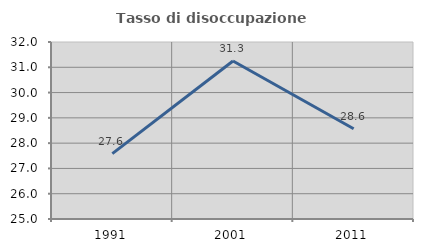
| Category | Tasso di disoccupazione giovanile  |
|---|---|
| 1991.0 | 27.586 |
| 2001.0 | 31.25 |
| 2011.0 | 28.571 |